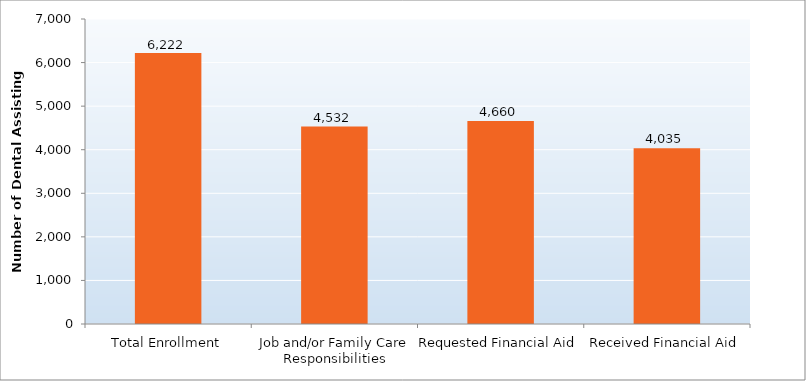
| Category | Series 0 |
|---|---|
| Total Enrollment | 6222 |
| Job and/or Family Care Responsibilities | 4532 |
| Requested Financial Aid | 4660 |
| Received Financial Aid | 4035 |